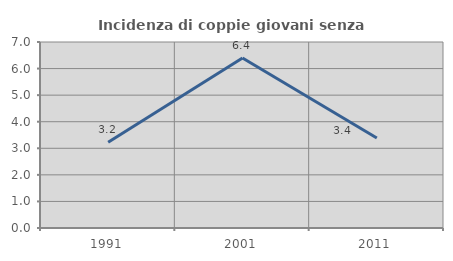
| Category | Incidenza di coppie giovani senza figli |
|---|---|
| 1991.0 | 3.226 |
| 2001.0 | 6.4 |
| 2011.0 | 3.39 |